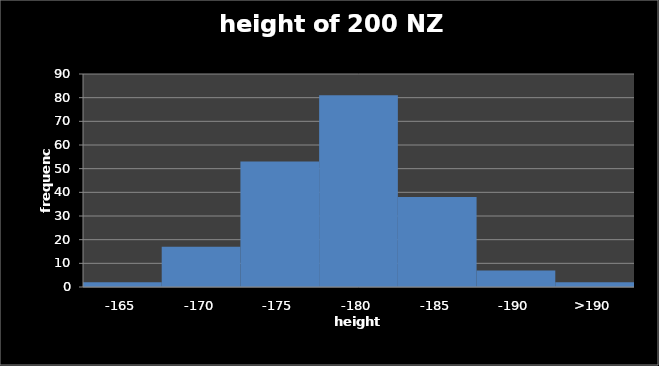
| Category | sample 30 |
|---|---|
| -165 | 2 |
| -170 | 17 |
| -175 | 53 |
| -180 | 81 |
| -185 | 38 |
| -190 | 7 |
| >190 | 2 |